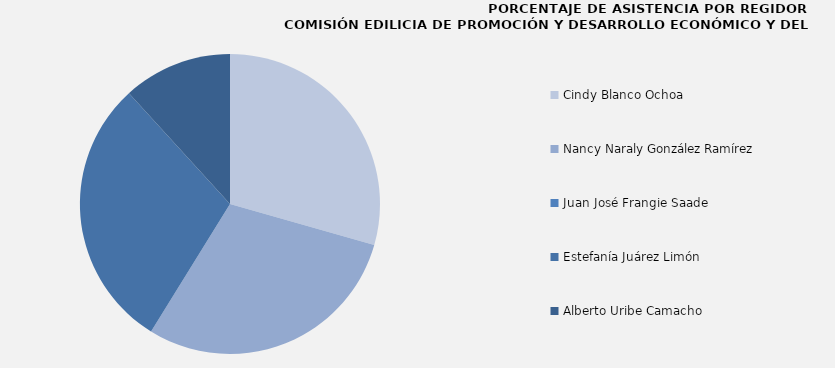
| Category | Series 0 |
|---|---|
| Cindy Blanco Ochoa | 100 |
| Nancy Naraly González Ramírez | 100 |
| Juan José Frangie Saade | 0 |
| Estefanía Juárez Limón | 100 |
| Alberto Uribe Camacho | 40 |